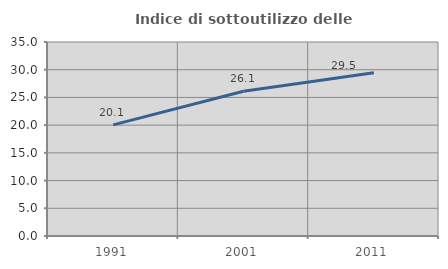
| Category | Indice di sottoutilizzo delle abitazioni  |
|---|---|
| 1991.0 | 20.054 |
| 2001.0 | 26.111 |
| 2011.0 | 29.454 |